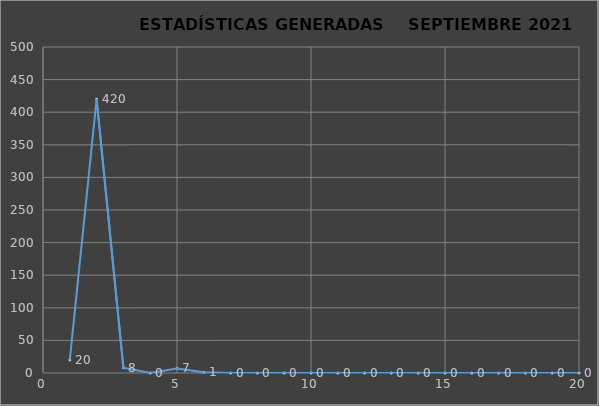
| Category |                   ESTADÍSTICAS GENERADAS     PERÍODO SEPTIEMBRE 2021 CANTIDAD |
|---|---|
| 0 | 20 |
| 1 | 420 |
| 2 | 8 |
| 3 | 0 |
| 4 | 7 |
| 5 | 1 |
| 6 | 0 |
| 7 | 0 |
| 8 | 0 |
| 9 | 0 |
| 10 | 0 |
| 11 | 0 |
| 12 | 0 |
| 13 | 0 |
| 14 | 0 |
| 15 | 0 |
| 16 | 0 |
| 17 | 0 |
| 18 | 0 |
| 19 | 0 |